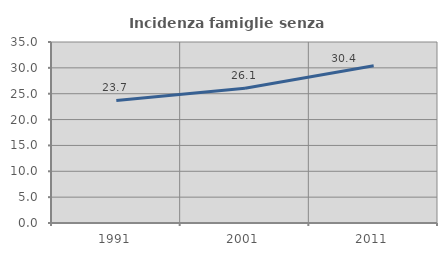
| Category | Incidenza famiglie senza nuclei |
|---|---|
| 1991.0 | 23.694 |
| 2001.0 | 26.076 |
| 2011.0 | 30.422 |